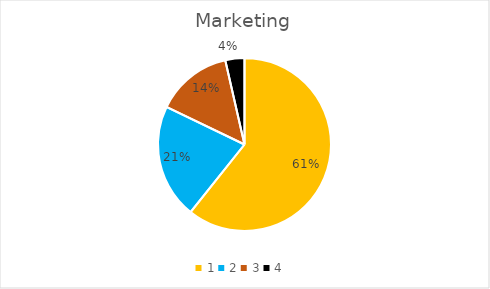
| Category | Series 0 |
|---|---|
| 0 | 0.607 |
| 1 | 0.214 |
| 2 | 0.143 |
| 3 | 0.036 |